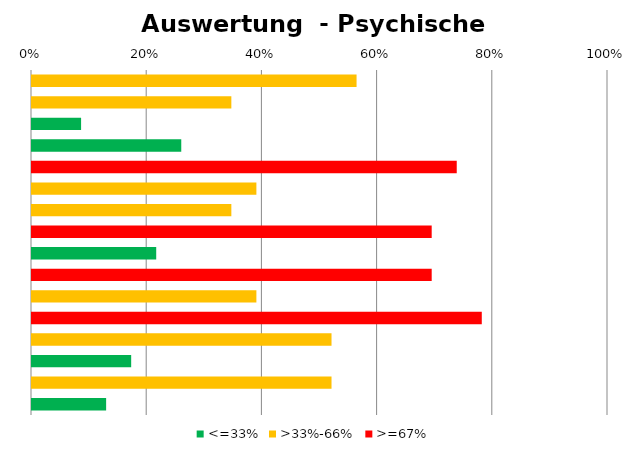
| Category | <=33% | >33%-66% | >=67% |
|---|---|---|---|
| Frage 1 | 0 | 0.565 | 0 |
| Frage 2 | 0 | 0.348 | 0 |
| Frage 3 | 0.087 | 0 | 0 |
| Frage 4 | 0.261 | 0 | 0 |
| Frage 5 | 0 | 0 | 0.739 |
| Frage 6 | 0 | 0.391 | 0 |
| Frage 7 | 0 | 0.348 | 0 |
| Frage 8 | 0 | 0 | 0.696 |
| Frage 9 | 0.217 | 0 | 0 |
| Frage 10 | 0 | 0 | 0.696 |
| Frage 11 | 0 | 0.391 | 0 |
| Frage 12 | 0 | 0 | 0.783 |
| Frage 13 | 0 | 0.522 | 0 |
| Frage 14 | 0.174 | 0 | 0 |
| Frage 15 | 0 | 0.522 | 0 |
| Frage 16 | 0.13 | 0 | 0 |